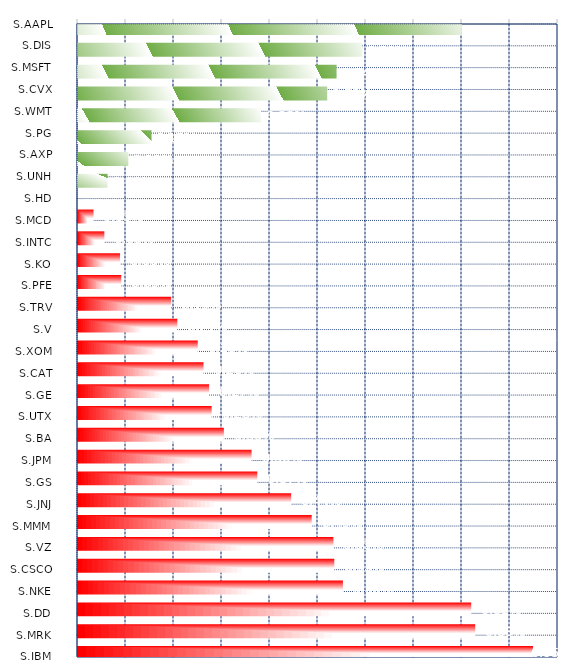
| Category | Series 0 | Series 1 |
|---|---|---|
| S.AAPL | 0 | 0.008 |
| S.DIS | 0 | 0.006 |
| S.MSFT | 0 | 0.005 |
| S.CVX | 0 | 0.005 |
| S.WMT | 0 | 0.004 |
| S.PG | 0 | 0.002 |
| S.AXP | 0 | 0.001 |
| S.UNH | 0 | 0.001 |
| S.HD | 0 | 0 |
| S.MCD | 0 | 0 |
| S.INTC | 0.001 | 0 |
| S.KO | 0.001 | 0 |
| S.PFE | 0.001 | 0 |
| S.TRV | 0.002 | 0 |
| S.V | 0.002 | 0 |
| S.XOM | 0.002 | 0 |
| S.CAT | 0.003 | 0 |
| S.GE | 0.003 | 0 |
| S.UTX | 0.003 | 0 |
| S.BA | 0.003 | 0 |
| S.JPM | 0.004 | 0 |
| S.GS | 0.004 | 0 |
| S.JNJ | 0.004 | 0 |
| S.MMM | 0.005 | 0 |
| S.VZ | 0.005 | 0 |
| S.CSCO | 0.005 | 0 |
| S.NKE | 0.006 | 0 |
| S.DD | 0.008 | 0 |
| S.MRK | 0.008 | 0 |
| S.IBM | 0.009 | 0 |